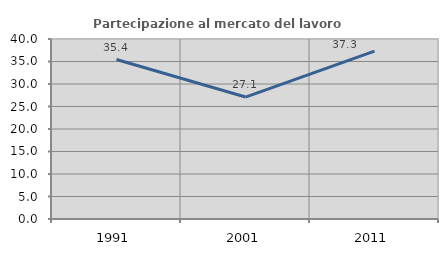
| Category | Partecipazione al mercato del lavoro  femminile |
|---|---|
| 1991.0 | 35.433 |
| 2001.0 | 27.1 |
| 2011.0 | 37.293 |